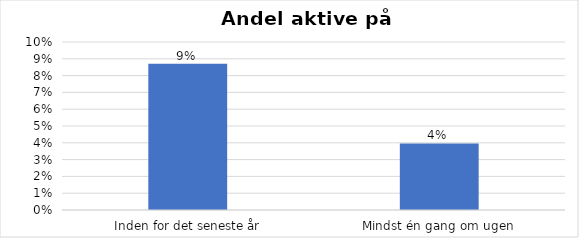
| Category | % |
|---|---|
| Inden for det seneste år | 0.087 |
| Mindst én gang om ugen | 0.04 |